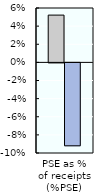
| Category | 2000-02 | 2018-20 |
|---|---|---|
| PSE as %
of receipts (%PSE) | 0.052 | -0.092 |